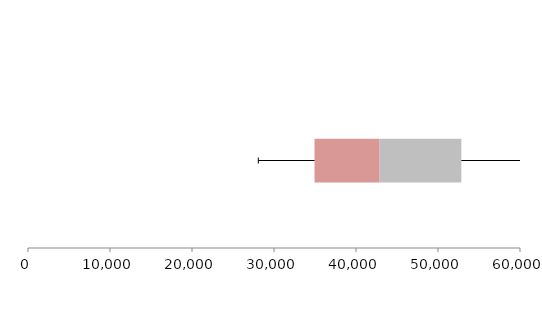
| Category | Series 1 | Series 2 | Series 3 |
|---|---|---|---|
| 0 | 34939.117 | 7939.782 | 9966.023 |